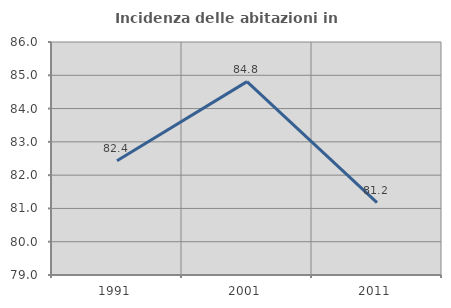
| Category | Incidenza delle abitazioni in proprietà  |
|---|---|
| 1991.0 | 82.435 |
| 2001.0 | 84.809 |
| 2011.0 | 81.175 |